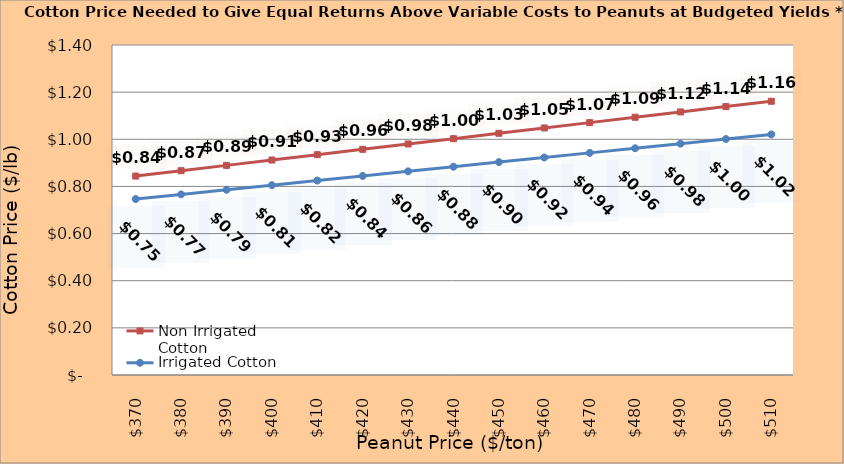
| Category | Non Irrigated Cotton | Irrigated Cotton |
|---|---|---|
| 370.0 | 0.844 | 0.747 |
| 380.0 | 0.867 | 0.766 |
| 390.0 | 0.889 | 0.786 |
| 400.0 | 0.912 | 0.805 |
| 410.0 | 0.935 | 0.825 |
| 420.0 | 0.957 | 0.844 |
| 430.0 | 0.98 | 0.864 |
| 440.0 | 1.003 | 0.884 |
| 450.0 | 1.025 | 0.903 |
| 460.0 | 1.048 | 0.923 |
| 470.0 | 1.071 | 0.942 |
| 480.0 | 1.093 | 0.962 |
| 490.0 | 1.116 | 0.982 |
| 500.0 | 1.139 | 1.001 |
| 510.0 | 1.161 | 1.021 |